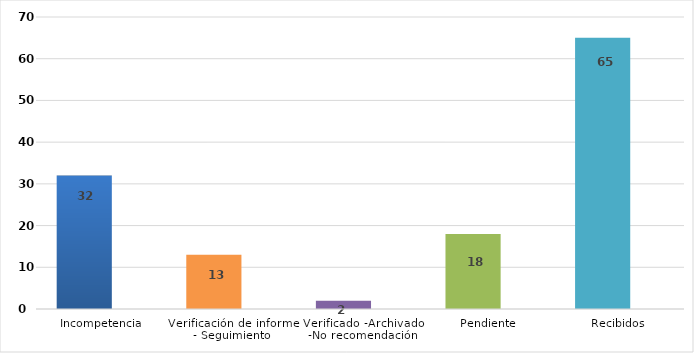
| Category | 2014 2015 | Series 1 |
|---|---|---|
| Incompetencia | 32 |  |
| Verificación de informe - Seguimiento | 13 |  |
| Verificado -Archivado -No recomendación | 2 |  |
| Pendiente  | 18 |  |
| Recibidos | 65 |  |